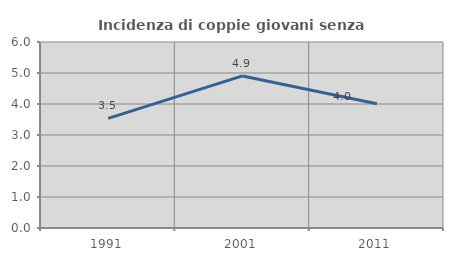
| Category | Incidenza di coppie giovani senza figli |
|---|---|
| 1991.0 | 3.534 |
| 2001.0 | 4.906 |
| 2011.0 | 4.007 |